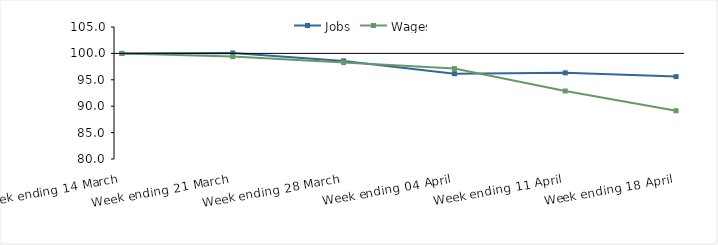
| Category | Jobs | Wages |
|---|---|---|
| 0 | 100 | 100 |
| 1900-01-01 | 100.068 | 99.39 |
| 1900-01-02 | 98.574 | 98.267 |
| 1900-01-03 | 96.157 | 97.141 |
| 1900-01-04 | 96.316 | 92.882 |
| 1900-01-05 | 95.606 | 89.144 |